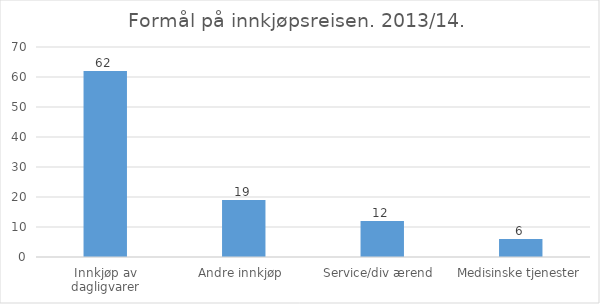
| Category | Andel reiser (i %) |
|---|---|
| Innkjøp av dagligvarer | 62 |
| Andre innkjøp  | 19 |
| Service/div ærend  | 12 |
| Medisinske tjenester | 6 |